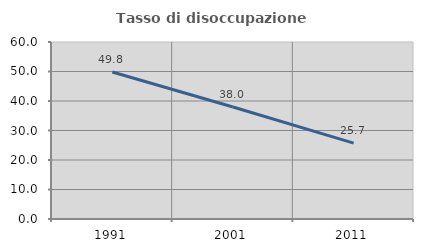
| Category | Tasso di disoccupazione giovanile  |
|---|---|
| 1991.0 | 49.814 |
| 2001.0 | 37.984 |
| 2011.0 | 25.735 |